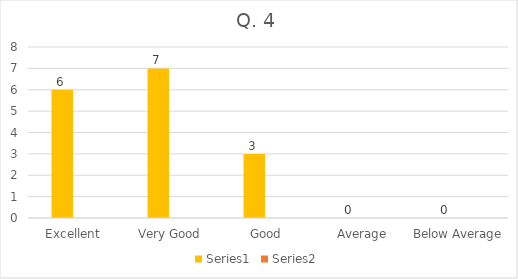
| Category | Series 0 | Series 1 |
|---|---|---|
| Excellent  | 6 |  |
| Very Good | 7 |  |
| Good | 3 |  |
| Average | 0 |  |
| Below Average | 0 |  |